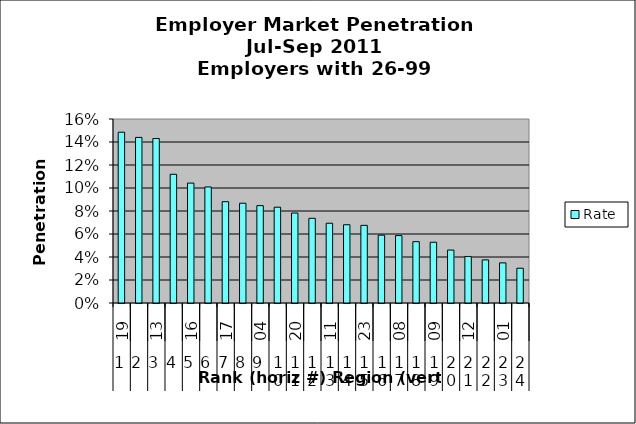
| Category | Rate |
|---|---|
| 0 | 0.149 |
| 1 | 0.144 |
| 2 | 0.143 |
| 3 | 0.112 |
| 4 | 0.104 |
| 5 | 0.101 |
| 6 | 0.088 |
| 7 | 0.087 |
| 8 | 0.085 |
| 9 | 0.083 |
| 10 | 0.078 |
| 11 | 0.074 |
| 12 | 0.069 |
| 13 | 0.068 |
| 14 | 0.068 |
| 15 | 0.059 |
| 16 | 0.059 |
| 17 | 0.053 |
| 18 | 0.053 |
| 19 | 0.046 |
| 20 | 0.04 |
| 21 | 0.037 |
| 22 | 0.035 |
| 23 | 0.03 |